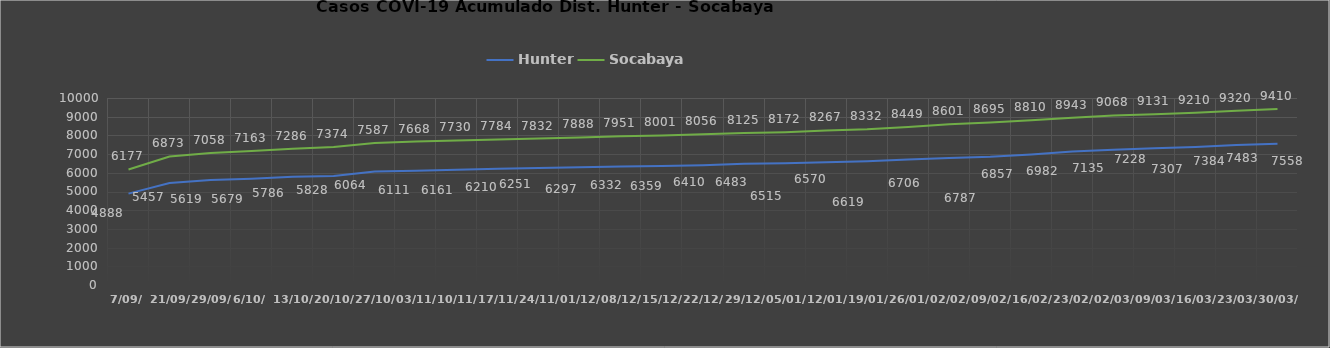
| Category | Hunter | Socabaya |
|---|---|---|
| 7/09/ | 4888 | 6177 |
| 21/09/ | 5457 | 6873 |
| 29/09/ | 5619 | 7058 |
| 6/10/ | 5679 | 7163 |
| 13/10/ | 5786 | 7286 |
| 20/10/ | 5828 | 7374 |
| 27/10/ | 6064 | 7587 |
| 03/11/ | 6111 | 7668 |
| 10/11/ | 6161 | 7730 |
| 17/11/ | 6210 | 7784 |
| 24/11/ | 6251 | 7832 |
| 01/12/ | 6297 | 7888 |
| 08/12/ | 6332 | 7951 |
| 15/12/ | 6359 | 8001 |
| 22/12/ | 6410 | 8056 |
| 29/12/ | 6483 | 8125 |
| 05/01/ | 6515 | 8172 |
| 12/01/ | 6570 | 8267 |
| 19/01/ | 6619 | 8332 |
| 26/01/ | 6706 | 8449 |
| 02/02/ | 6787 | 8601 |
| 09/02/ | 6857 | 8695 |
| 16/02/ | 6982 | 8810 |
| 23/02/ | 7135 | 8943 |
| 02/03/ | 7228 | 9068 |
| 09/03/ | 7307 | 9131 |
| 16/03/ | 7384 | 9210 |
| 23/03/ | 7483 | 9320 |
| 30/03/ | 7558 | 9410 |